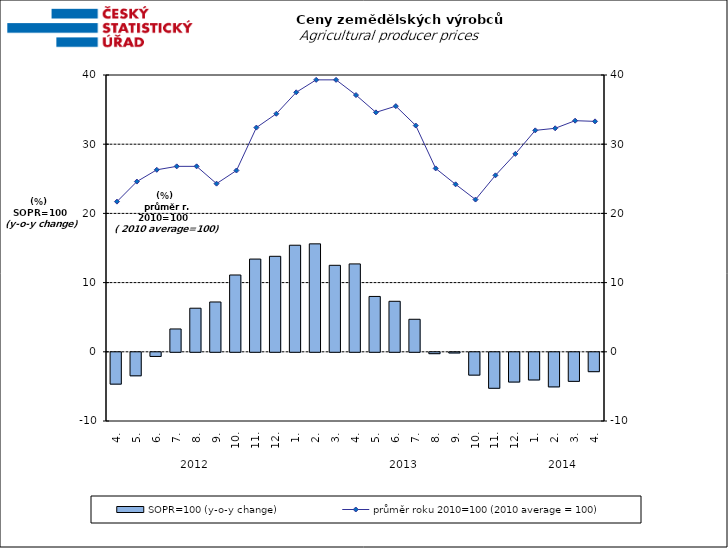
| Category | SOPR=100 (y-o-y change)   |
|---|---|
| 0 | -4.6 |
| 1 | -3.4 |
| 2 | -0.6 |
| 3 | 3.3 |
| 4 | 6.3 |
| 5 | 7.2 |
| 6 | 11.1 |
| 7 | 13.4 |
| 8 | 13.8 |
| 9 | 15.4 |
| 10 | 15.6 |
| 11 | 12.5 |
| 12 | 12.7 |
| 13 | 8 |
| 14 | 7.3 |
| 15 | 4.7 |
| 16 | -0.2 |
| 17 | -0.1 |
| 18 | -3.3 |
| 19 | -5.2 |
| 20 | -4.3 |
| 21 | -4 |
| 22 | -5 |
| 23 | -4.2 |
| 24 | -2.8 |